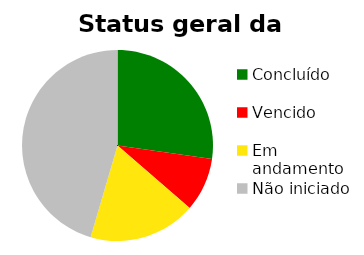
| Category | Series 0 |
|---|---|
| Concluído | 0.273 |
| Vencido | 0.091 |
| Em andamento | 0.182 |
| Não iniciado | 0.455 |